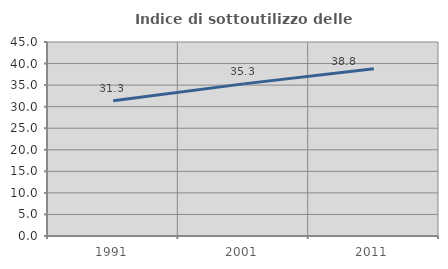
| Category | Indice di sottoutilizzo delle abitazioni  |
|---|---|
| 1991.0 | 31.348 |
| 2001.0 | 35.286 |
| 2011.0 | 38.795 |